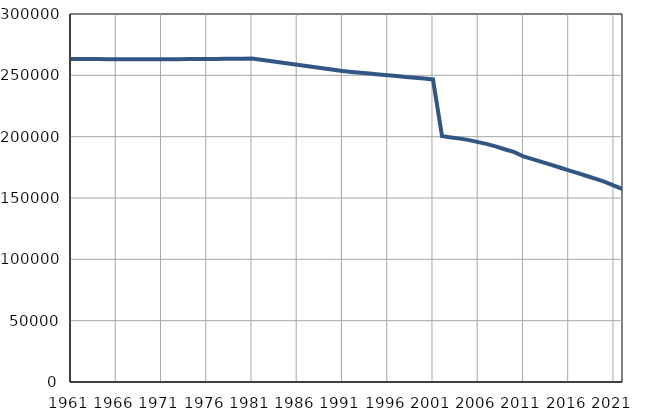
| Category | Број
становника |
|---|---|
| 1961.0 | 263344 |
| 1962.0 | 263311 |
| 1963.0 | 263278 |
| 1964.0 | 263245 |
| 1965.0 | 263212 |
| 1966.0 | 263180 |
| 1967.0 | 263147 |
| 1968.0 | 263114 |
| 1969.0 | 263081 |
| 1970.0 | 263048 |
| 1971.0 | 263015 |
| 1972.0 | 263081 |
| 1973.0 | 263147 |
| 1974.0 | 263214 |
| 1975.0 | 263280 |
| 1976.0 | 263346 |
| 1977.0 | 263412 |
| 1978.0 | 263478 |
| 1979.0 | 263545 |
| 1980.0 | 263611 |
| 1981.0 | 263677 |
| 1982.0 | 262659 |
| 1983.0 | 261640 |
| 1984.0 | 260622 |
| 1985.0 | 259603 |
| 1986.0 | 258585 |
| 1987.0 | 257566 |
| 1988.0 | 256548 |
| 1989.0 | 255530 |
| 1990.0 | 254511 |
| 1991.0 | 253492 |
| 1992.0 | 252812 |
| 1993.0 | 252132 |
| 1994.0 | 251452 |
| 1995.0 | 250772 |
| 1996.0 | 250092 |
| 1997.0 | 249411 |
| 1998.0 | 248731 |
| 1999.0 | 248051 |
| 2000.0 | 247371 |
| 2001.0 | 246691 |
| 2002.0 | 200454 |
| 2003.0 | 199347 |
| 2004.0 | 198400 |
| 2005.0 | 197194 |
| 2006.0 | 195570 |
| 2007.0 | 193944 |
| 2008.0 | 191906 |
| 2009.0 | 189556 |
| 2010.0 | 187341 |
| 2011.0 | 183860 |
| 2012.0 | 181666 |
| 2013.0 | 179451 |
| 2014.0 | 177217 |
| 2015.0 | 174888 |
| 2016.0 | 172515 |
| 2017.0 | 170207 |
| 2018.0 | 167922 |
| 2019.0 | 165635 |
| 2020.0 | 163058 |
| 2021.0 | 160070 |
| 2022.0 | 157064 |